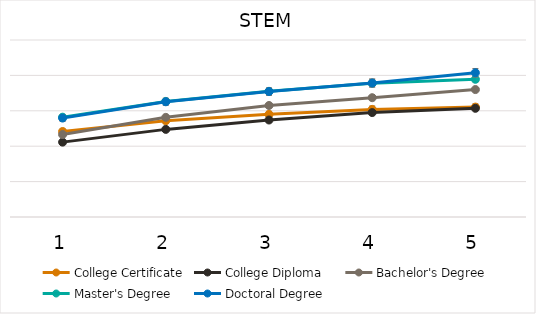
| Category | College Certificate | College Diploma | Bachelor's Degree | Master's Degree | Doctoral Degree |
|---|---|---|---|---|---|
| 1.0 | 48300 | 42300 | 46600 | 56400 | 55900 |
| 2.0 | 54400 | 49500 | 56300 | 65300 | 65100 |
| 3.0 | 58000 | 54800 | 63000 | 71000 | 70900 |
| 4.0 | 60800 | 59000 | 67400 | 75600 | 75700 |
| 5.0 | 62100 | 61400 | 72000 | 77800 | 81500 |